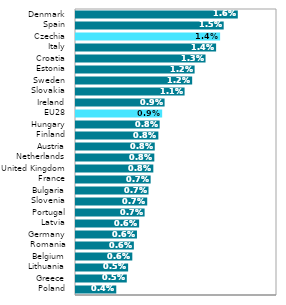
| Category | Series 0 |
|---|---|
| Poland | 0.004 |
| Greece | 0.005 |
| Lithuania | 0.005 |
| Belgium | 0.006 |
| Romania | 0.006 |
| Germany | 0.006 |
| Latvia | 0.006 |
| Portugal | 0.007 |
| Slovenia | 0.007 |
| Bulgaria | 0.007 |
| France | 0.007 |
| United Kingdom | 0.008 |
| Netherlands | 0.008 |
| Austria | 0.008 |
| Finland | 0.008 |
| Hungary | 0.008 |
| EU28 | 0.009 |
| Ireland | 0.009 |
| Slovakia | 0.011 |
| Sweden | 0.012 |
| Estonia | 0.012 |
| Croatia | 0.013 |
| Italy | 0.014 |
| Czechia | 0.014 |
| Spain | 0.015 |
| Denmark | 0.016 |